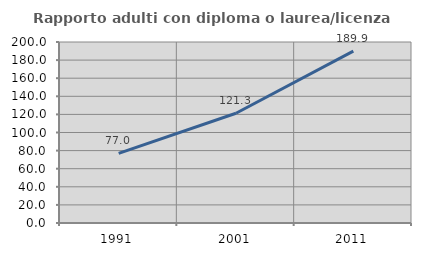
| Category | Rapporto adulti con diploma o laurea/licenza media  |
|---|---|
| 1991.0 | 76.967 |
| 2001.0 | 121.298 |
| 2011.0 | 189.949 |